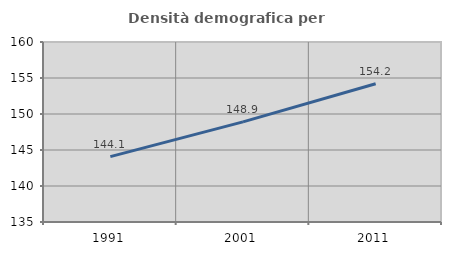
| Category | Densità demografica |
|---|---|
| 1991.0 | 144.082 |
| 2001.0 | 148.906 |
| 2011.0 | 154.203 |